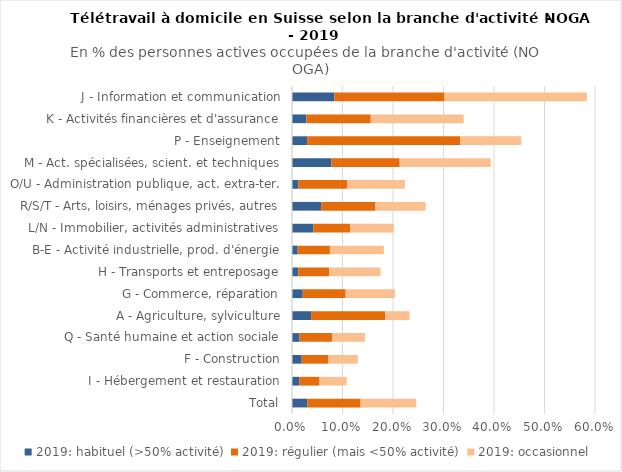
| Category | 2019: habituel (>50% activité) | 2019: régulier (mais <50% activité) | 2019: occasionnel  |
|---|---|---|---|
| Total | 0.03 | 0.106 | 0.11 |
| I - Hébergement et restauration | 0.014 | 0.04 | 0.054 |
| F - Construction | 0.019 | 0.053 | 0.058 |
| Q - Santé humaine et action sociale | 0.015 | 0.064 | 0.065 |
| A - Agriculture, sylviculture | 0.038 | 0.147 | 0.048 |
| G - Commerce, réparation | 0.021 | 0.085 | 0.097 |
| H - Transports et entreposage | 0.012 | 0.061 | 0.102 |
| B-E - Activité industrielle, prod. d'énergie | 0.011 | 0.064 | 0.107 |
| L/N - Immobilier, activités administratives | 0.043 | 0.073 | 0.086 |
| R/S/T - Arts, loisirs, ménages privés, autres | 0.058 | 0.107 | 0.1 |
| O/U - Administration publique, act. extra-ter. | 0.013 | 0.096 | 0.115 |
| M - Act. spécialisées, scient. et techniques | 0.078 | 0.135 | 0.18 |
| P - Enseignement | 0.03 | 0.303 | 0.121 |
| K - Activités financières et d'assurance | 0.029 | 0.127 | 0.184 |
| J - Information et communication | 0.084 | 0.218 | 0.282 |